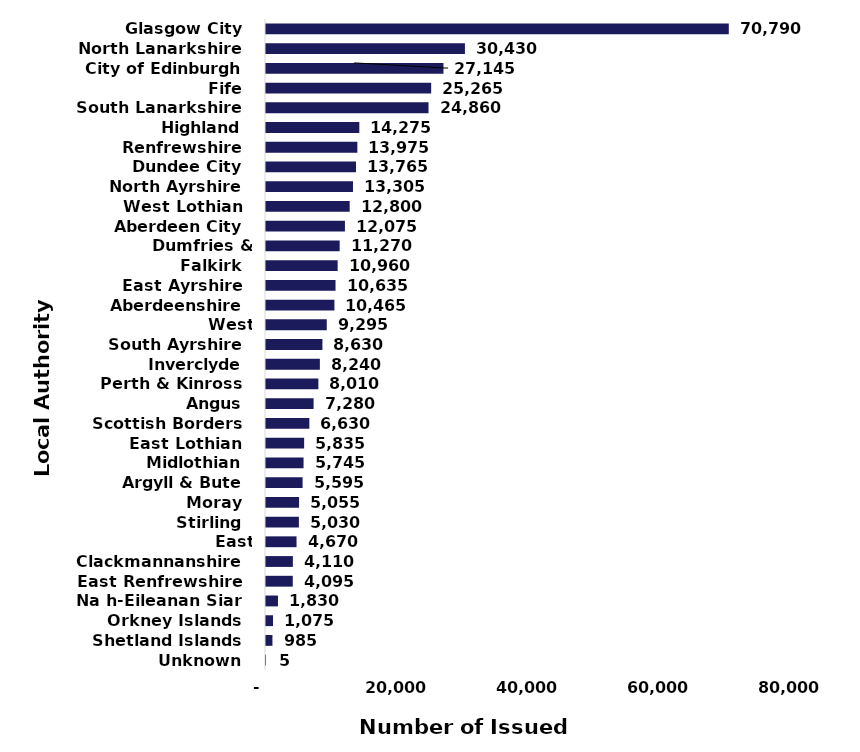
| Category | Number of Issued Payments |
|---|---|
|  Glasgow City  | 70790 |
|  North Lanarkshire  | 30430 |
|  City of Edinburgh  | 27145 |
|  Fife  | 25265 |
|  South Lanarkshire  | 24860 |
|  Highland  | 14275 |
|  Renfrewshire  | 13975 |
|  Dundee City  | 13765 |
|  North Ayrshire  | 13305 |
|  West Lothian  | 12800 |
|  Aberdeen City  | 12075 |
|  Dumfries & Galloway  | 11270 |
|  Falkirk  | 10960 |
|  East Ayrshire  | 10635 |
|  Aberdeenshire  | 10465 |
|  West Dunbartonshire  | 9295 |
|  South Ayrshire  | 8630 |
|  Inverclyde  | 8240 |
|  Perth & Kinross  | 8010 |
|  Angus  | 7280 |
|  Scottish Borders  | 6630 |
|  East Lothian  | 5835 |
|  Midlothian  | 5745 |
|  Argyll & Bute  | 5595 |
|  Moray  | 5055 |
|  Stirling  | 5030 |
|  East Dunbartonshire  | 4670 |
|  Clackmannanshire  | 4110 |
|  East Renfrewshire  | 4095 |
|  Na h-Eileanan Siar  | 1830 |
|  Orkney Islands  | 1075 |
|  Shetland Islands  | 985 |
|  Unknown  | 5 |